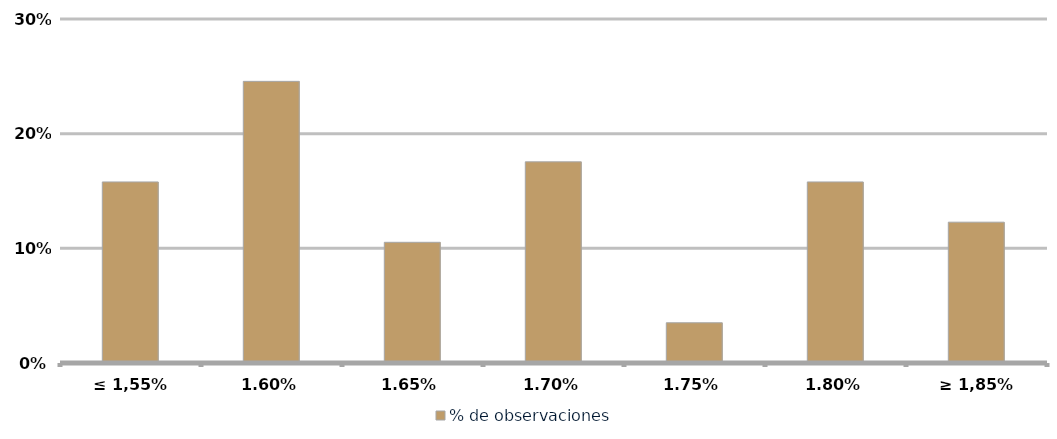
| Category | % de observaciones  |
|---|---|
| ≤ 1,55% | 0.158 |
| 1,60% | 0.246 |
| 1,65% | 0.105 |
| 1,70% | 0.175 |
| 1,75% | 0.035 |
| 1,80% | 0.158 |
| ≥ 1,85% | 0.123 |